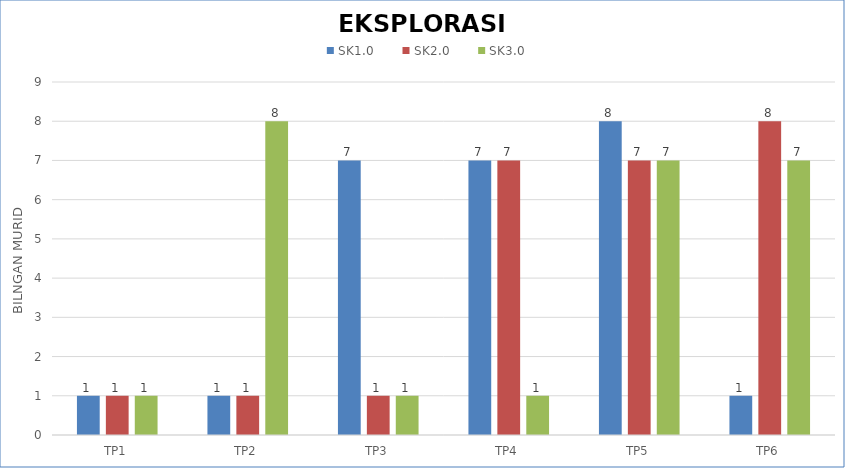
| Category | SK1.0 | SK2.0 | SK3.0 |
|---|---|---|---|
| TP1 | 1 | 1 | 1 |
| TP2 | 1 | 1 | 8 |
| TP3 | 7 | 1 | 1 |
| TP4 | 7 | 7 | 1 |
| TP5 | 8 | 7 | 7 |
| TP6 | 1 | 8 | 7 |